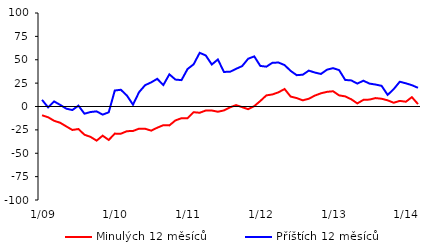
| Category | Minulých 12 měsíců | Příštích 12 měsíců |
|---|---|---|
|  1/09 | -9.4 | 7.1 |
|  2/09 | -11.5 | -0.9 |
|  3/09 | -15.3 | 5.4 |
|  4/09 | -17.4 | 1.7 |
|  5/09 | -21.3 | -2.3 |
|  6/09 | -25.1 | -3.8 |
|  7/09 | -24.1 | 0.9 |
|  8/09 | -30.2 | -7.7 |
|  9/09 | -32.5 | -5.9 |
|  10/09 | -36.5 | -5.2 |
|  11/09 | -31.2 | -8.7 |
|  12/09 | -35.8 | -6.2 |
|  1/10 | -29 | 17.1 |
|  2/10 | -29.1 | 17.9 |
|  3/10 | -26.4 | 11.7 |
|  4/10 | -26.2 | 1.9 |
|  5/10 | -23.7 | 15.3 |
|  6/10 | -23.8 | 22.8 |
|  7/10 | -25.8 | 25.8 |
|  8/10 | -22.7 | 29.6 |
|  9/10 | -20 | 22.9 |
|  10/10 | -20.2 | 34.4 |
|  11/10 | -14.9 | 28.8 |
|  12/10 | -12.5 | 28.2 |
|  1/11 | -12.6 | 40.1 |
|  2/11 | -6.1 | 45.1 |
|  3/11 | -6.7 | 57.4 |
|  4/11 | -4.3 | 54.6 |
|  5/11 | -4.3 | 44.9 |
|  6/11 | -5.6 | 50.3 |
|  7/11 | -4.2 | 37 |
|  8/11 | -0.9 | 37.1 |
|  9/11 | 1.5 | 40.3 |
|  10/11 | -0.7 | 43.2 |
|  11/11 | -2.9 | 51.1 |
|  12/11 | 0.4 | 53.6 |
|  1/12 | 5.9 | 43.4 |
|  2/12 | 11.9 | 42.6 |
|  3/12 | 12.9 | 46.8 |
|  4/12 | 15.2 | 47 |
|  5/12 | 18.7 | 44.3 |
|  6/12 | 10.6 | 38.1 |
|  7/12 | 9 | 33.5 |
|  8/12 | 6.6 | 34 |
|  9/12 | 8.3 | 38.4 |
|  10/12 | 11.7 | 36.3 |
|  11/12 | 14.1 | 34.8 |
|  12/12 | 15.7 | 39.4 |
|  1/13 | 16.3 | 41 |
|  2/13 | 11.9 | 38.9 |
|  3/13 | 10.8 | 28.4 |
|  4/13 | 7.7 | 27.9 |
|  5/13 | 3.3 | 24.5 |
|  6/13 | 7.1 | 27.6 |
|  7/13 | 7.4 | 24.5 |
|  8/13 | 9 | 23.5 |
|  9/13 | 8.3 | 22.1 |
|  10/13 | 6.6 | 12.4 |
|  11/13 | 4 | 18.6 |
|  12/13 | 6 | 26.5 |
|  1/14 | 5.1 | 24.8 |
|  2/14 | 10 | 22.8 |
|  3/14 | 2.6 | 20 |